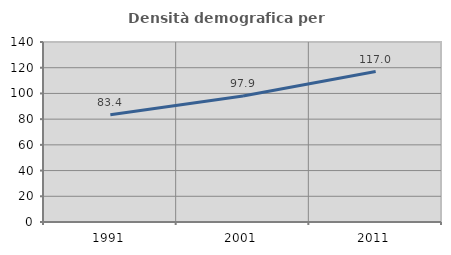
| Category | Densità demografica |
|---|---|
| 1991.0 | 83.436 |
| 2001.0 | 97.934 |
| 2011.0 | 116.981 |